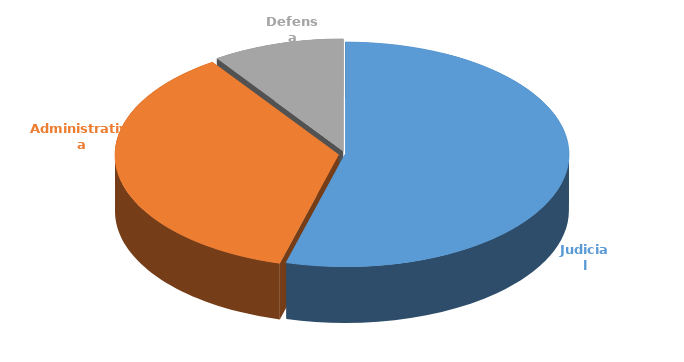
| Category | Cantidad |
|---|---|
| Judicial | 352 |
| Administrativa | 235 |
| Defensa | 62 |